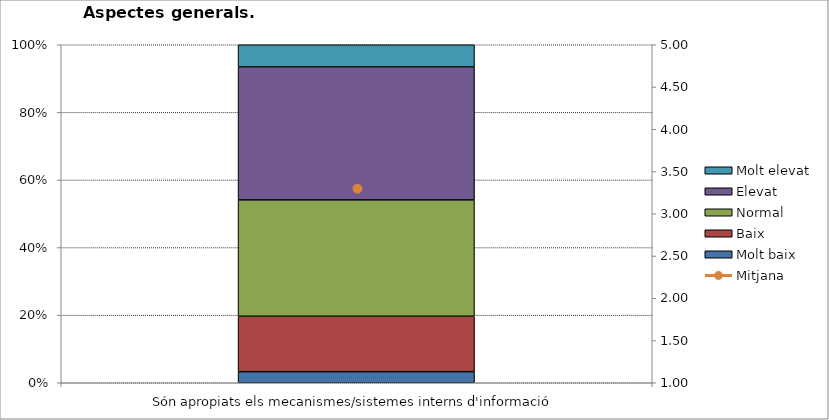
| Category | Molt baix | Baix | Normal  | Elevat | Molt elevat |
|---|---|---|---|---|---|
| Són apropiats els mecanismes/sistemes interns d'informació | 2 | 10 | 21 | 24 | 4 |